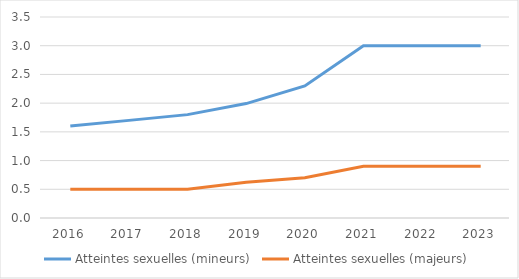
| Category | Atteintes sexuelles (mineurs) | Atteintes sexuelles (majeurs) |
|---|---|---|
| 2016.0 | 1.6 | 0.5 |
| 2017.0 | 1.7 | 0.5 |
| 2018.0 | 1.8 | 0.5 |
| 2019.0 | 1.992 | 0.622 |
| 2020.0 | 2.3 | 0.7 |
| 2021.0 | 3 | 0.9 |
| 2022.0 | 3 | 0.9 |
| 2023.0 | 3 | 0.9 |